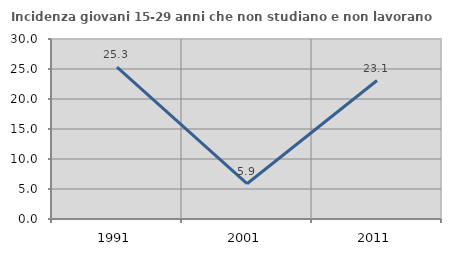
| Category | Incidenza giovani 15-29 anni che non studiano e non lavorano  |
|---|---|
| 1991.0 | 25.301 |
| 2001.0 | 5.882 |
| 2011.0 | 23.077 |